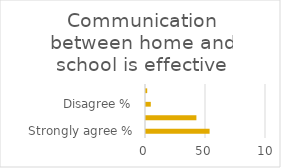
| Category | Series 1 |
|---|---|
| Strongly agree % | 53 |
| Agree % | 42 |
| Disagree % | 4 |
| Strongly disagree % | 1 |